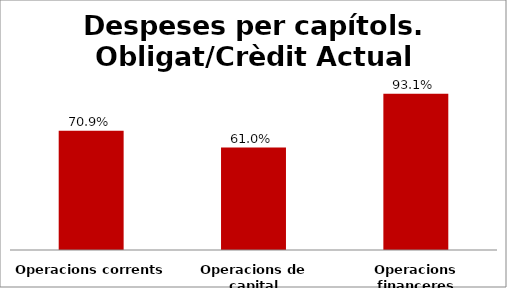
| Category | Series 0 |
|---|---|
| Operacions corrents | 0.709 |
| Operacions de capital | 0.61 |
| Operacions financeres | 0.931 |